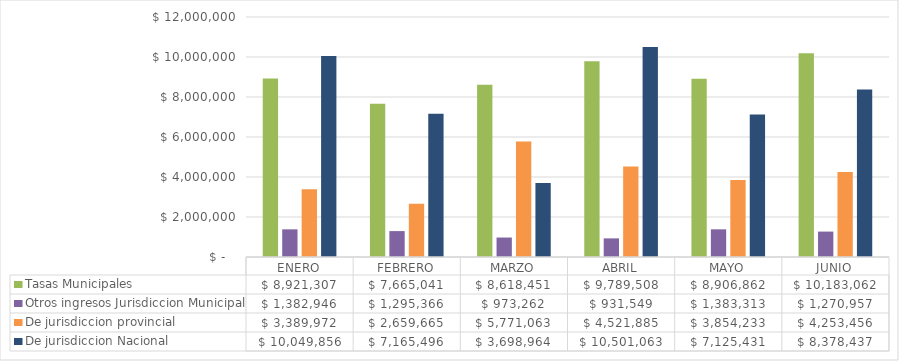
| Category | Tasas Municipales | Otros ingresos Jurisdiccion Municipal | De jurisdiccion provincial | De jurisdiccion Nacional |
|---|---|---|---|---|
| ENERO | 8921307.3 | 1382946.24 | 3389972.07 | 10049855.86 |
| FEBRERO | 7665040.56 | 1295366 | 2659664.55 | 7165496.12 |
| MARZO | 8618451.43 | 973262.21 | 5771063.2 | 3698964.26 |
| ABRIL | 9789508.15 | 931548.8 | 4521884.79 | 10501063.2 |
| MAYO | 8906861.84 | 1383313.43 | 3854233.49 | 7125431.39 |
| JUNIO | 10183062.03 | 1270956.92 | 4253455.78 | 8378437.29 |